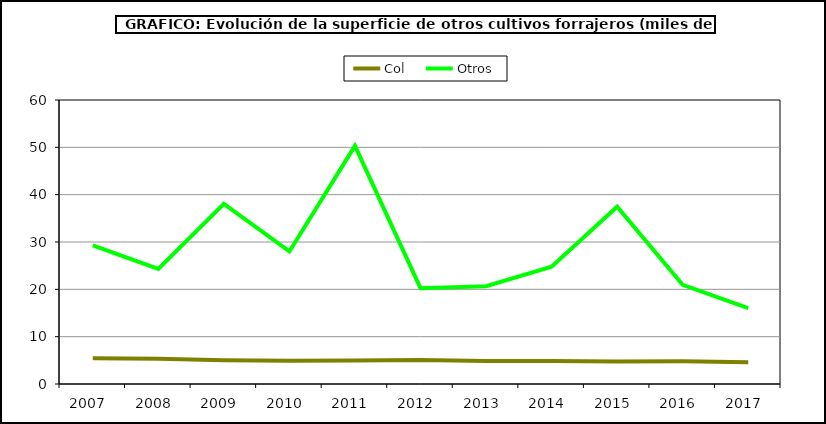
| Category | Col | Otros |
|---|---|---|
| 2007.0 | 5.431 | 29.302 |
| 2008.0 | 5.333 | 24.321 |
| 2009.0 | 4.996 | 38.075 |
| 2010.0 | 4.899 | 27.997 |
| 2011.0 | 4.982 | 50.317 |
| 2012.0 | 5.09 | 20.245 |
| 2013.0 | 4.865 | 20.659 |
| 2014.0 | 4.875 | 24.797 |
| 2015.0 | 4.771 | 37.464 |
| 2016.0 | 4.781 | 20.965 |
| 2017.0 | 4.601 | 16.007 |